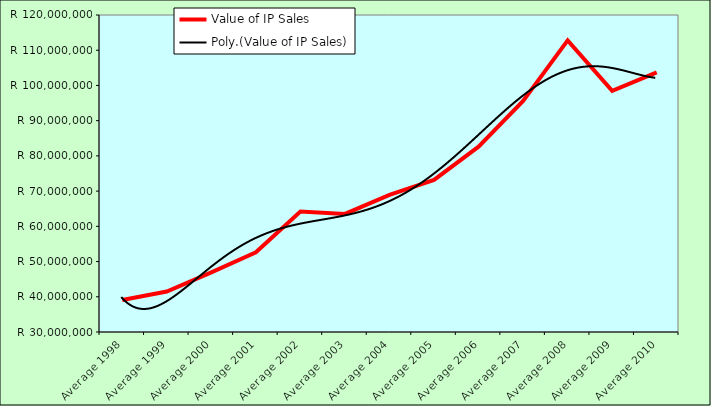
| Category | Value of IP Sales |
|---|---|
| Average 1998 | 39064997.167 |
| Average 1999 | 41498816.583 |
| Average 2000 | 46906615.833 |
| Average 2001 | 52614116.083 |
| Average 2002 | 64216592.5 |
| Average 2003 | 63518696.833 |
| Average 2004 | 68920125.583 |
| Average 2005 | 73199986.5 |
| Average 2006 | 82623586.75 |
| Average 2007 | 95629656.182 |
| Average 2008 | 112782411.583 |
| Average 2009 | 98468336.75 |
| Average 2010 | 103714363 |